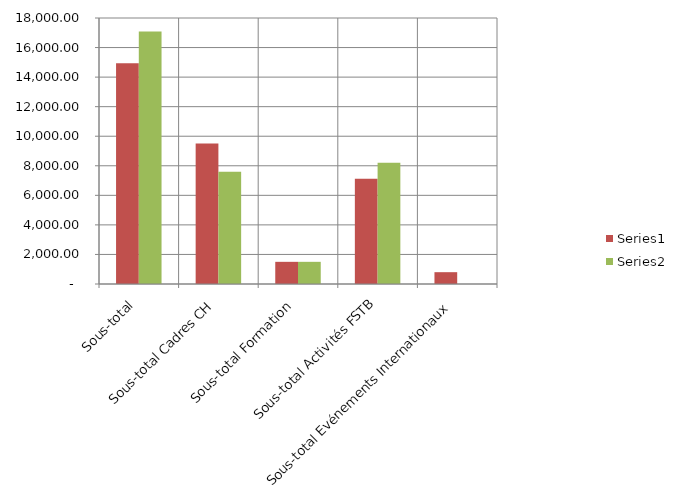
| Category | Series 0 | Series 1 |
|---|---|---|
| Sous-total | 14935 | 17080 |
| Sous-total Cadres CH | 9500 | 7600 |
| Sous-total Formation | 1500 | 1500 |
| Sous-total Activités FSTB | 7130 | 8200 |
| Sous-total Evénements Internationaux | 800 | 0 |